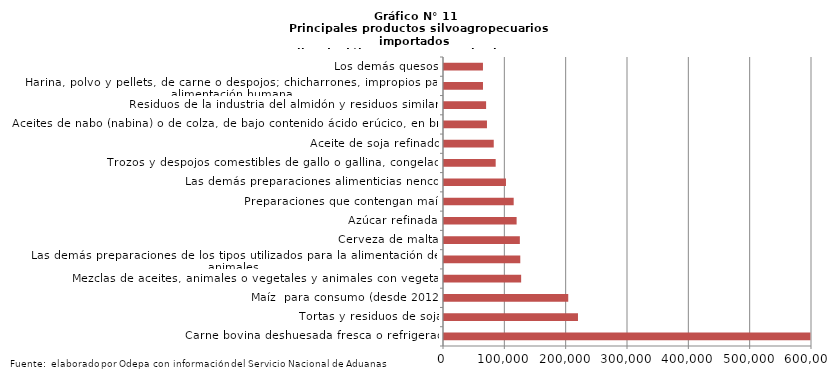
| Category | Series 0 |
|---|---|
| Carne bovina deshuesada fresca o refrigerada | 597381.786 |
| Tortas y residuos de soja | 218450.689 |
| Maíz  para consumo (desde 2012) | 202557.019 |
| Mezclas de aceites, animales o vegetales y animales con vegetales | 125785.186 |
| Las demás preparaciones de los tipos utilizados para la alimentación de los animales | 124372.116 |
| Cerveza de malta | 123676.74 |
| Azúcar refinada | 118400.915 |
| Preparaciones que contengan maíz | 113615.909 |
| Las demás preparaciones alimenticias nencop | 101031.615 |
| Trozos y despojos comestibles de gallo o gallina, congelados | 84264.307 |
| Aceite de soja refinado | 81109.752 |
| Aceites de nabo (nabina) o de colza, de bajo contenido ácido erúcico, en bruto | 70046.068 |
| Residuos de la industria del almidón y residuos similares | 68647.367 |
| Harina, polvo y pellets, de carne o despojos; chicharrones, impropios para la alimentación humana | 63550.414 |
| Los demás quesos | 63518.319 |